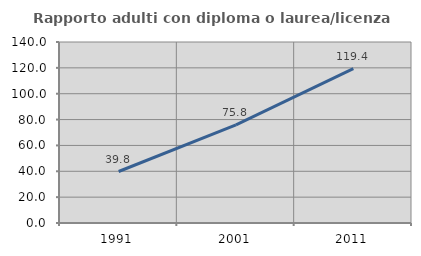
| Category | Rapporto adulti con diploma o laurea/licenza media  |
|---|---|
| 1991.0 | 39.833 |
| 2001.0 | 75.848 |
| 2011.0 | 119.421 |